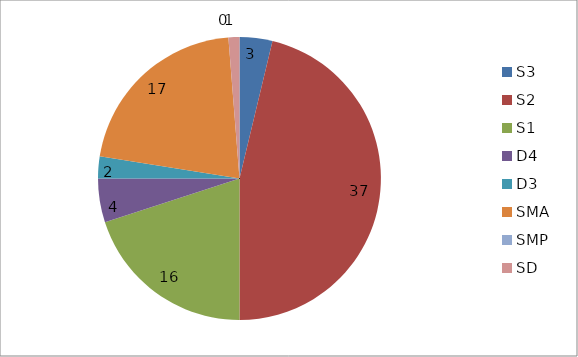
| Category | Series 0 |
|---|---|
| S3 | 3 |
| S2 | 37 |
| S1 | 16 |
| D4 | 4 |
| D3 | 2 |
| SMA | 17 |
| SMP | 0 |
| SD | 1 |